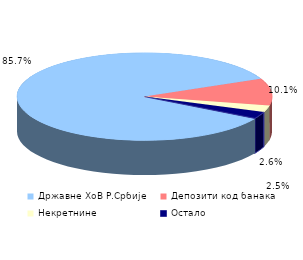
| Category | Series 0 |
|---|---|
| Државне ХоВ Р.Србије | 0.857 |
| Депозити код банака | 0.101 |
| Некретнине | 0.025 |
| Остало | 0.026 |